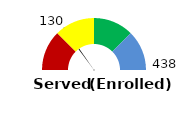
| Category | Series 1 |
|---|---|
| 0 | 29.68 |
| 1 | 1 |
| 2 | 169.32 |